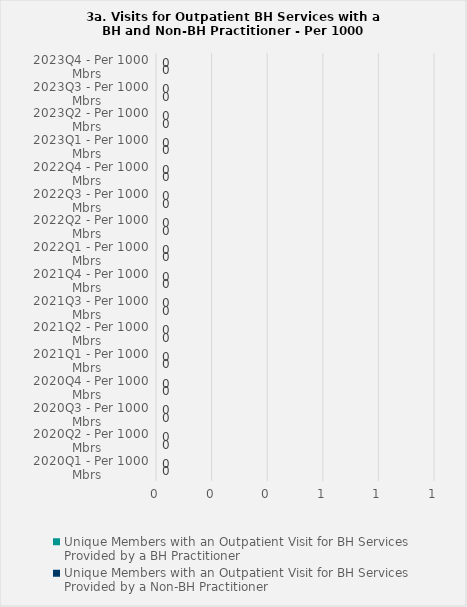
| Category | Unique Members with an Outpatient Visit for BH Services Provided by a BH Practitioner | Unique Members with an Outpatient Visit for BH Services Provided by a Non-BH Practitioner |
|---|---|---|
| 2020Q1 - Per 1000 Mbrs | 0 | 0 |
| 2020Q2 - Per 1000 Mbrs | 0 | 0 |
| 2020Q3 - Per 1000 Mbrs | 0 | 0 |
| 2020Q4 - Per 1000 Mbrs | 0 | 0 |
| 2021Q1 - Per 1000 Mbrs | 0 | 0 |
| 2021Q2 - Per 1000 Mbrs | 0 | 0 |
| 2021Q3 - Per 1000 Mbrs | 0 | 0 |
| 2021Q4 - Per 1000 Mbrs | 0 | 0 |
| 2022Q1 - Per 1000 Mbrs | 0 | 0 |
| 2022Q2 - Per 1000 Mbrs | 0 | 0 |
| 2022Q3 - Per 1000 Mbrs | 0 | 0 |
| 2022Q4 - Per 1000 Mbrs | 0 | 0 |
| 2023Q1 - Per 1000 Mbrs | 0 | 0 |
| 2023Q2 - Per 1000 Mbrs | 0 | 0 |
| 2023Q3 - Per 1000 Mbrs | 0 | 0 |
| 2023Q4 - Per 1000 Mbrs | 0 | 0 |